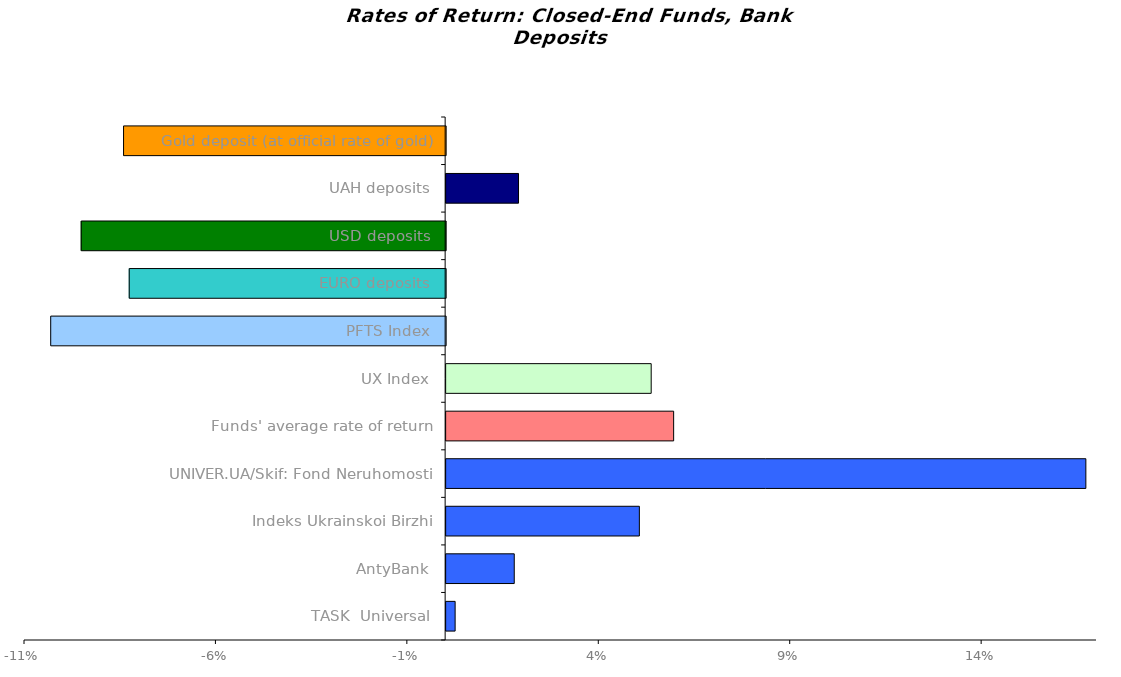
| Category | Series 0 |
|---|---|
| TASK  Universal | 0.002 |
| AntyBank | 0.018 |
| Indeks Ukrainskoi Birzhi | 0.05 |
| UNIVER.UA/Skif: Fond Neruhomosti | 0.167 |
| Funds' average rate of return | 0.059 |
| UX Index | 0.054 |
| PFTS Index | -0.103 |
| EURO deposits | -0.083 |
| USD deposits | -0.095 |
| UAH deposits | 0.019 |
| Gold deposit (at official rate of gold) | -0.084 |